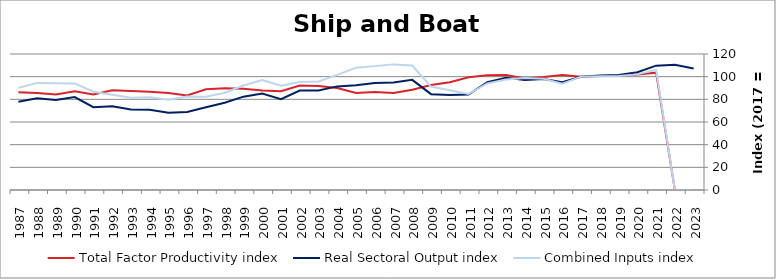
| Category | Total Factor Productivity index | Real Sectoral Output index | Combined Inputs index |
|---|---|---|---|
| 2023.0 | 0 | 107.131 | 0 |
| 2022.0 | 0 | 110.433 | 0 |
| 2021.0 | 103.518 | 109.74 | 106.01 |
| 2020.0 | 101.842 | 103.903 | 102.024 |
| 2019.0 | 100.802 | 101.457 | 100.649 |
| 2018.0 | 100.673 | 101.022 | 100.347 |
| 2017.0 | 100 | 100 | 100 |
| 2016.0 | 101.396 | 95.08 | 93.771 |
| 2015.0 | 99.611 | 97.837 | 98.219 |
| 2014.0 | 98.367 | 97.158 | 98.772 |
| 2013.0 | 101.538 | 98.985 | 97.486 |
| 2012.0 | 101.157 | 95.086 | 93.999 |
| 2011.0 | 99.447 | 84.205 | 84.673 |
| 2010.0 | 95.057 | 83.745 | 88.1 |
| 2009.0 | 92.646 | 84.573 | 91.286 |
| 2008.0 | 88.491 | 97.164 | 109.801 |
| 2007.0 | 85.645 | 94.931 | 110.843 |
| 2006.0 | 86.422 | 94.462 | 109.304 |
| 2005.0 | 85.601 | 92.395 | 107.936 |
| 2004.0 | 89.989 | 91.417 | 101.587 |
| 2003.0 | 91.721 | 87.837 | 95.766 |
| 2002.0 | 92.232 | 87.823 | 95.22 |
| 2001.0 | 87.241 | 80.207 | 91.937 |
| 2000.0 | 87.78 | 85.072 | 96.915 |
| 1999.0 | 89.354 | 82.354 | 92.167 |
| 1998.0 | 89.723 | 76.996 | 85.815 |
| 1997.0 | 88.811 | 73.063 | 82.268 |
| 1996.0 | 83.347 | 68.78 | 82.523 |
| 1995.0 | 85.682 | 68.242 | 79.646 |
| 1994.0 | 86.618 | 70.832 | 81.775 |
| 1993.0 | 87.329 | 71.133 | 81.455 |
| 1992.0 | 87.966 | 73.85 | 83.953 |
| 1991.0 | 84.204 | 73.014 | 86.711 |
| 1990.0 | 87.128 | 81.961 | 94.069 |
| 1989.0 | 84.21 | 79.358 | 94.237 |
| 1988.0 | 85.683 | 80.984 | 94.515 |
| 1987.0 | 86.359 | 77.794 | 90.081 |